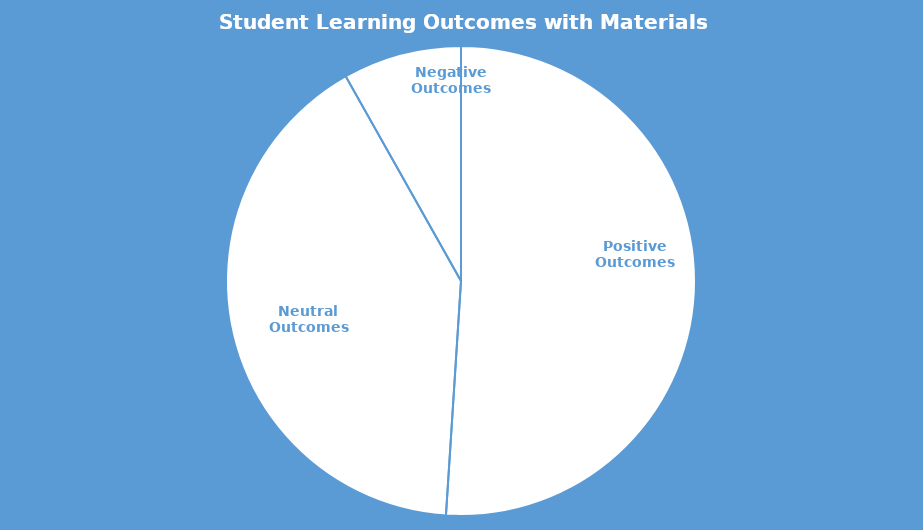
| Category | Series 0 |
|---|---|
| Positive Outcomes | 0.51 |
| Neutral Outcomes | 0.408 |
| Negative Outcomes | 0.082 |